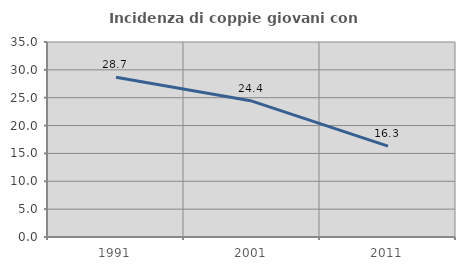
| Category | Incidenza di coppie giovani con figli |
|---|---|
| 1991.0 | 28.67 |
| 2001.0 | 24.401 |
| 2011.0 | 16.323 |